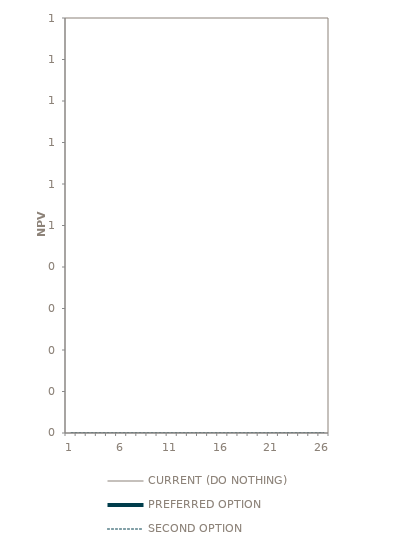
| Category | CURRENT (DO NOTHING) | PREFERRED OPTION | SECOND OPTION |
|---|---|---|---|
| 1.0 | 0 |  | 0 |
| 2.0 | 0 |  | 0 |
| 3.0 | 0 |  | 0 |
| 4.0 | 0 |  | 0 |
| 5.0 | 0 |  | 0 |
| 6.0 | 0 |  | 0 |
| 7.0 | 0 |  | 0 |
| 8.0 | 0 |  | 0 |
| 9.0 | 0 |  | 0 |
| 10.0 | 0 |  | 0 |
| 11.0 | 0 |  | 0 |
| 12.0 | 0 |  | 0 |
| 13.0 | 0 |  | 0 |
| 14.0 | 0 |  | 0 |
| 15.0 | 0 |  | 0 |
| 16.0 | 0 |  | 0 |
| 17.0 | 0 |  | 0 |
| 18.0 | 0 |  | 0 |
| 19.0 | 0 |  | 0 |
| 20.0 | 0 |  | 0 |
| 21.0 | 0 |  | 0 |
| 22.0 | 0 |  | 0 |
| 23.0 | 0 |  | 0 |
| 24.0 | 0 |  | 0 |
| 25.0 | 0 |  | 0 |
| 26.0 | 0 |  | 0 |